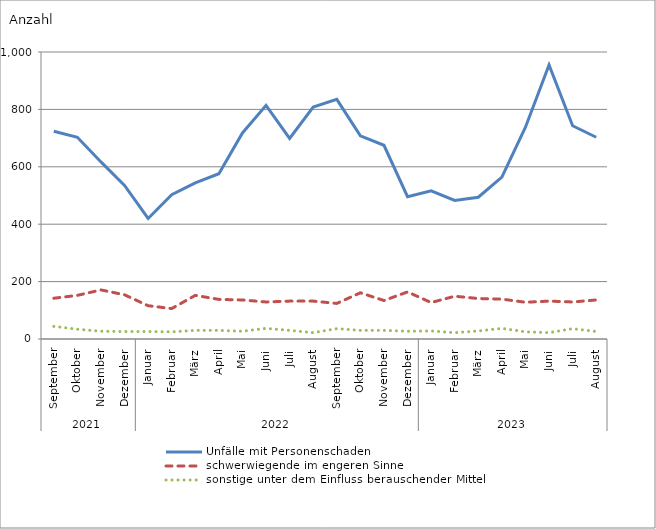
| Category | Unfälle mit Personenschaden | schwerwiegende im engeren Sinne | sonstige unter dem Einfluss berauschender Mittel |
|---|---|---|---|
| 0 | 724 | 142 | 44 |
| 1 | 703 | 152 | 34 |
| 2 | 617 | 171 | 27 |
| 3 | 535 | 154 | 26 |
| 4 | 420 | 116 | 26 |
| 5 | 503 | 106 | 25 |
| 6 | 544 | 152 | 30 |
| 7 | 576 | 138 | 30 |
| 8 | 718 | 136 | 27 |
| 9 | 814 | 129 | 37 |
| 10 | 699 | 132 | 30 |
| 11 | 808 | 132 | 22 |
| 12 | 835 | 124 | 36 |
| 13 | 708 | 161 | 30 |
| 14 | 675 | 134 | 30 |
| 15 | 496 | 164 | 27 |
| 16 | 516 | 127 | 28 |
| 17 | 483 | 149 | 22 |
| 18 | 494 | 141 | 28 |
| 19 | 564 | 139 | 37 |
| 20 | 738 | 128 | 25 |
| 21 | 955 | 132 | 22 |
| 22 | 743 | 129 | 36 |
| 23 | 703 | 136 | 26 |